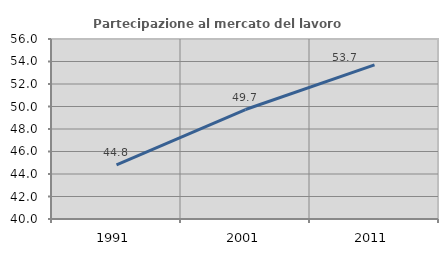
| Category | Partecipazione al mercato del lavoro  femminile |
|---|---|
| 1991.0 | 44.812 |
| 2001.0 | 49.733 |
| 2011.0 | 53.704 |